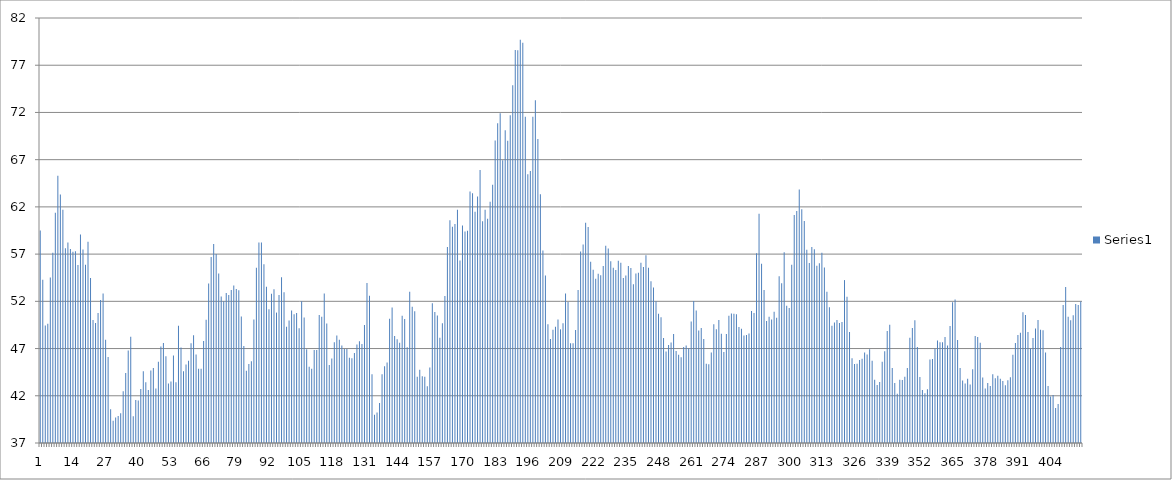
| Category | Series 0 |
|---|---|
| 0 | 59.508 |
| 1 | 54.296 |
| 2 | 49.432 |
| 3 | 49.633 |
| 4 | 54.536 |
| 5 | 57.152 |
| 6 | 61.379 |
| 7 | 65.297 |
| 8 | 63.302 |
| 9 | 61.707 |
| 10 | 57.632 |
| 11 | 58.221 |
| 12 | 57.54 |
| 13 | 57.25 |
| 14 | 57.297 |
| 15 | 55.84 |
| 16 | 59.066 |
| 17 | 57.5 |
| 18 | 55.879 |
| 19 | 58.316 |
| 20 | 54.482 |
| 21 | 50.033 |
| 22 | 49.706 |
| 23 | 50.762 |
| 24 | 52.151 |
| 25 | 52.82 |
| 26 | 47.924 |
| 27 | 46.106 |
| 28 | 40.566 |
| 29 | 39.352 |
| 30 | 39.703 |
| 31 | 39.866 |
| 32 | 40.151 |
| 33 | 42.467 |
| 34 | 44.4 |
| 35 | 46.794 |
| 36 | 48.237 |
| 37 | 39.843 |
| 38 | 41.554 |
| 39 | 41.513 |
| 40 | 42.717 |
| 41 | 44.608 |
| 42 | 43.44 |
| 43 | 42.617 |
| 44 | 44.688 |
| 45 | 44.942 |
| 46 | 42.781 |
| 47 | 45.613 |
| 48 | 47.226 |
| 49 | 47.598 |
| 50 | 46.19 |
| 51 | 43.303 |
| 52 | 43.502 |
| 53 | 46.257 |
| 54 | 43.425 |
| 55 | 49.404 |
| 56 | 47.113 |
| 57 | 44.584 |
| 58 | 45.314 |
| 59 | 45.72 |
| 60 | 47.567 |
| 61 | 48.42 |
| 62 | 46.383 |
| 63 | 44.871 |
| 64 | 44.873 |
| 65 | 47.792 |
| 66 | 50.044 |
| 67 | 53.888 |
| 68 | 56.682 |
| 69 | 58.061 |
| 70 | 57.01 |
| 71 | 54.937 |
| 72 | 52.513 |
| 73 | 52 |
| 74 | 52.88 |
| 75 | 52.667 |
| 76 | 53.192 |
| 77 | 53.684 |
| 78 | 53.305 |
| 79 | 53.161 |
| 80 | 50.381 |
| 81 | 47.28 |
| 82 | 44.662 |
| 83 | 45.36 |
| 84 | 45.647 |
| 85 | 50.073 |
| 86 | 55.546 |
| 87 | 58.233 |
| 88 | 58.242 |
| 89 | 55.933 |
| 90 | 53.532 |
| 91 | 51.174 |
| 92 | 52.815 |
| 93 | 53.286 |
| 94 | 50.81 |
| 95 | 52.676 |
| 96 | 54.55 |
| 97 | 52.969 |
| 98 | 49.314 |
| 99 | 49.959 |
| 100 | 51.023 |
| 101 | 50.641 |
| 102 | 50.776 |
| 103 | 49.14 |
| 104 | 51.996 |
| 105 | 50.294 |
| 106 | 46.938 |
| 107 | 45.064 |
| 108 | 44.87 |
| 109 | 46.834 |
| 110 | 46.857 |
| 111 | 50.547 |
| 112 | 50.359 |
| 113 | 52.828 |
| 114 | 49.662 |
| 115 | 45.266 |
| 116 | 45.947 |
| 117 | 47.674 |
| 118 | 48.373 |
| 119 | 47.928 |
| 120 | 47.312 |
| 121 | 46.945 |
| 122 | 46.944 |
| 123 | 46.028 |
| 124 | 45.978 |
| 125 | 46.525 |
| 126 | 47.442 |
| 127 | 47.783 |
| 128 | 47.494 |
| 129 | 49.491 |
| 130 | 53.952 |
| 131 | 52.594 |
| 132 | 44.28 |
| 133 | 39.992 |
| 134 | 40.225 |
| 135 | 41.248 |
| 136 | 44.273 |
| 137 | 45.136 |
| 138 | 45.523 |
| 139 | 50.16 |
| 140 | 51.351 |
| 141 | 48.339 |
| 142 | 47.974 |
| 143 | 47.608 |
| 144 | 50.464 |
| 145 | 50.127 |
| 146 | 47.131 |
| 147 | 53.003 |
| 148 | 51.416 |
| 149 | 50.958 |
| 150 | 44.017 |
| 151 | 44.754 |
| 152 | 44.058 |
| 153 | 44.005 |
| 154 | 43.001 |
| 155 | 45.004 |
| 156 | 51.8 |
| 157 | 50.864 |
| 158 | 50.513 |
| 159 | 48.15 |
| 160 | 49.666 |
| 161 | 52.564 |
| 162 | 57.76 |
| 163 | 60.595 |
| 164 | 59.898 |
| 165 | 60.19 |
| 166 | 61.686 |
| 167 | 56.33 |
| 168 | 60.032 |
| 169 | 59.396 |
| 170 | 59.481 |
| 171 | 63.618 |
| 172 | 63.436 |
| 173 | 61.475 |
| 174 | 63.099 |
| 175 | 65.894 |
| 176 | 60.488 |
| 177 | 61.696 |
| 178 | 60.739 |
| 179 | 62.553 |
| 180 | 64.344 |
| 181 | 69.018 |
| 182 | 70.846 |
| 183 | 71.921 |
| 184 | 66.927 |
| 185 | 70.102 |
| 186 | 69 |
| 187 | 71.699 |
| 188 | 74.874 |
| 189 | 78.617 |
| 190 | 78.586 |
| 191 | 79.688 |
| 192 | 79.383 |
| 193 | 71.554 |
| 194 | 65.457 |
| 195 | 65.802 |
| 196 | 71.532 |
| 197 | 73.292 |
| 198 | 69.198 |
| 199 | 63.347 |
| 200 | 57.392 |
| 201 | 54.733 |
| 202 | 49.565 |
| 203 | 48.005 |
| 204 | 48.996 |
| 205 | 49.316 |
| 206 | 50.082 |
| 207 | 49.034 |
| 208 | 49.674 |
| 209 | 52.82 |
| 210 | 51.937 |
| 211 | 47.574 |
| 212 | 47.566 |
| 213 | 48.956 |
| 214 | 53.21 |
| 215 | 57.278 |
| 216 | 58.018 |
| 217 | 60.314 |
| 218 | 59.863 |
| 219 | 56.184 |
| 220 | 55.334 |
| 221 | 54.401 |
| 222 | 54.928 |
| 223 | 54.77 |
| 224 | 55.746 |
| 225 | 57.892 |
| 226 | 57.588 |
| 227 | 56.24 |
| 228 | 55.556 |
| 229 | 55.32 |
| 230 | 56.299 |
| 231 | 56.09 |
| 232 | 54.477 |
| 233 | 54.745 |
| 234 | 55.753 |
| 235 | 55.525 |
| 236 | 53.804 |
| 237 | 54.952 |
| 238 | 55.037 |
| 239 | 56.077 |
| 240 | 55.641 |
| 241 | 56.889 |
| 242 | 55.554 |
| 243 | 54.133 |
| 244 | 53.457 |
| 245 | 52.001 |
| 246 | 50.674 |
| 247 | 50.302 |
| 248 | 48.112 |
| 249 | 46.701 |
| 250 | 47.387 |
| 251 | 47.647 |
| 252 | 48.546 |
| 253 | 46.732 |
| 254 | 46.335 |
| 255 | 46.073 |
| 256 | 47.174 |
| 257 | 47.33 |
| 258 | 47.034 |
| 259 | 49.869 |
| 260 | 52.041 |
| 261 | 51.016 |
| 262 | 48.92 |
| 263 | 49.186 |
| 264 | 48.013 |
| 265 | 45.394 |
| 266 | 45.336 |
| 267 | 46.581 |
| 268 | 49.58 |
| 269 | 49.052 |
| 270 | 50.019 |
| 271 | 48.566 |
| 272 | 46.623 |
| 273 | 48.548 |
| 274 | 50.474 |
| 275 | 50.711 |
| 276 | 50.677 |
| 277 | 50.636 |
| 278 | 49.276 |
| 279 | 49.086 |
| 280 | 48.379 |
| 281 | 48.438 |
| 282 | 48.597 |
| 283 | 50.979 |
| 284 | 50.762 |
| 285 | 57.102 |
| 286 | 61.261 |
| 287 | 55.982 |
| 288 | 53.187 |
| 289 | 49.931 |
| 290 | 50.371 |
| 291 | 50.085 |
| 292 | 50.891 |
| 293 | 50.272 |
| 294 | 54.652 |
| 295 | 53.92 |
| 296 | 57.208 |
| 297 | 51.533 |
| 298 | 51.284 |
| 299 | 55.864 |
| 300 | 61.149 |
| 301 | 61.56 |
| 302 | 63.85 |
| 303 | 61.76 |
| 304 | 60.519 |
| 305 | 57.452 |
| 306 | 56.067 |
| 307 | 57.764 |
| 308 | 57.52 |
| 309 | 55.778 |
| 310 | 56.044 |
| 311 | 57.145 |
| 312 | 55.576 |
| 313 | 53.01 |
| 314 | 51.372 |
| 315 | 49.413 |
| 316 | 49.746 |
| 317 | 50.028 |
| 318 | 49.7 |
| 319 | 49.821 |
| 320 | 54.249 |
| 321 | 52.479 |
| 322 | 48.752 |
| 323 | 45.965 |
| 324 | 45.354 |
| 325 | 45.396 |
| 326 | 45.776 |
| 327 | 45.916 |
| 328 | 46.591 |
| 329 | 46.367 |
| 330 | 46.94 |
| 331 | 45.706 |
| 332 | 43.706 |
| 333 | 43.14 |
| 334 | 43.47 |
| 335 | 45.607 |
| 336 | 46.728 |
| 337 | 48.847 |
| 338 | 49.517 |
| 339 | 44.954 |
| 340 | 43.366 |
| 341 | 42.21 |
| 342 | 43.704 |
| 343 | 43.665 |
| 344 | 44.004 |
| 345 | 44.939 |
| 346 | 48.152 |
| 347 | 49.182 |
| 348 | 49.993 |
| 349 | 47.164 |
| 350 | 43.976 |
| 351 | 42.612 |
| 352 | 42.265 |
| 353 | 42.689 |
| 354 | 45.847 |
| 355 | 45.906 |
| 356 | 46.987 |
| 357 | 47.861 |
| 358 | 47.659 |
| 359 | 47.657 |
| 360 | 48.225 |
| 361 | 47.321 |
| 362 | 49.38 |
| 363 | 51.895 |
| 364 | 52.183 |
| 365 | 47.908 |
| 366 | 44.952 |
| 367 | 43.63 |
| 368 | 43.29 |
| 369 | 43.804 |
| 370 | 43.186 |
| 371 | 44.806 |
| 372 | 48.317 |
| 373 | 48.21 |
| 374 | 47.618 |
| 375 | 43.938 |
| 376 | 42.776 |
| 377 | 43.361 |
| 378 | 43.024 |
| 379 | 44.281 |
| 380 | 43.867 |
| 381 | 44.122 |
| 382 | 43.808 |
| 383 | 43.562 |
| 384 | 43.123 |
| 385 | 43.65 |
| 386 | 43.958 |
| 387 | 46.348 |
| 388 | 47.581 |
| 389 | 48.435 |
| 390 | 48.663 |
| 391 | 50.843 |
| 392 | 50.566 |
| 393 | 48.747 |
| 394 | 46.994 |
| 395 | 48.12 |
| 396 | 49.134 |
| 397 | 50.036 |
| 398 | 48.985 |
| 399 | 48.933 |
| 400 | 46.587 |
| 401 | 43.033 |
| 402 | 41.912 |
| 403 | 42.081 |
| 404 | 40.706 |
| 405 | 41.12 |
| 406 | 47.162 |
| 407 | 51.606 |
| 408 | 53.505 |
| 409 | 50.364 |
| 410 | 50.004 |
| 411 | 50.521 |
| 412 | 51.719 |
| 413 | 51.625 |
| 414 | 51.979 |